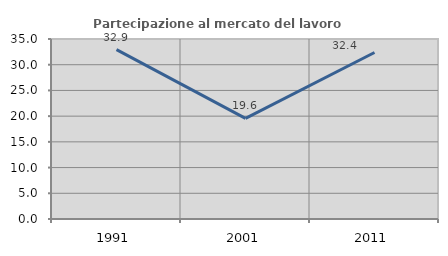
| Category | Partecipazione al mercato del lavoro  femminile |
|---|---|
| 1991.0 | 32.927 |
| 2001.0 | 19.56 |
| 2011.0 | 32.376 |